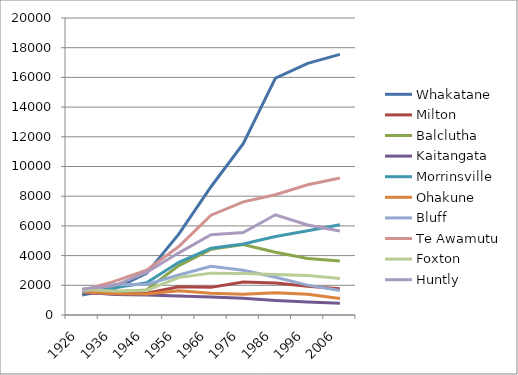
| Category | Whakatane | Milton | Balclutha | Kaitangata | Morrinsville | Ohakune | Bluff | Te Awamutu | Foxton | Huntly |
|---|---|---|---|---|---|---|---|---|---|---|
| 1926.0 | 1343.2 | 1505.891 | 1544.966 | 1549.975 | 1554.856 | 1559.971 | 1579.816 | 1657.631 | 1708.709 | 1745.142 |
| 1936.0 | 1763.459 | 1425.737 | 1548.973 | 1377.645 | 1827.566 | 1431.6 | 2046.831 | 2263.088 | 1617.027 | 1976.132 |
| 1946.0 | 2806 | 1472 | 1692 | 1351 | 2175 | 1411 | 2059 | 3017 | 1651 | 2870 |
| 1956.0 | 5445 | 1904 | 3323 | 1286 | 3552 | 1626 | 2693 | 4614 | 2525 | 4187 |
| 1966.0 | 8637 | 1861 | 4419 | 1208 | 4497 | 1458 | 3279 | 6719 | 2819 | 5401 |
| 1976.0 | 11542 | 2218 | 4740 | 1120 | 4783 | 1399 | 3016 | 7619 | 2789 | 5559 |
| 1986.0 | 15954 | 2154 | 4227 | 972 | 5281 | 1496 | 2537 | 8096 | 2729 | 6750 |
| 1996.0 | 16944.577 | 1939.841 | 3807.867 | 871.987 | 5667.047 | 1402.931 | 2010.511 | 8766.528 | 2662.733 | 6062.633 |
| 2006.0 | 17554.162 | 1759.824 | 3644.376 | 793.852 | 6083.254 | 1116.829 | 1644.124 | 9229.067 | 2463.932 | 5651.363 |